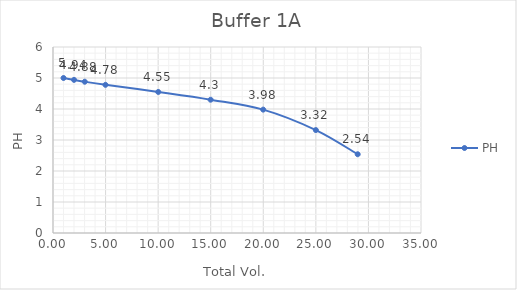
| Category | PH |
|---|---|
| 1.0 | 5 |
| 2.0 | 4.94 |
| 3.02 | 4.88 |
| 4.99 | 4.78 |
| 10.010000000000002 | 4.55 |
| 14.99 | 4.3 |
| 19.990000000000002 | 3.98 |
| 25.000000000000004 | 3.32 |
| 28.980000000000004 | 2.54 |